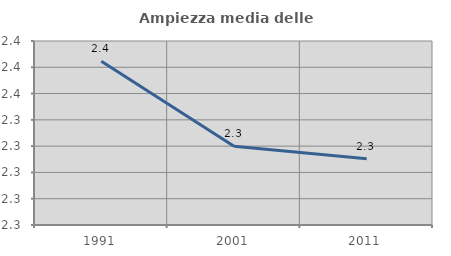
| Category | Ampiezza media delle famiglie |
|---|---|
| 1991.0 | 2.385 |
| 2001.0 | 2.32 |
| 2011.0 | 2.31 |